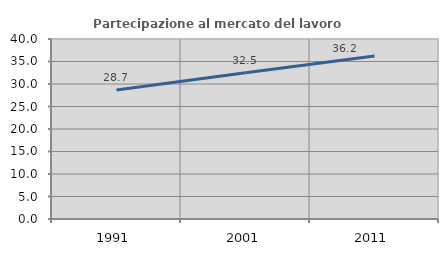
| Category | Partecipazione al mercato del lavoro  femminile |
|---|---|
| 1991.0 | 28.667 |
| 2001.0 | 32.48 |
| 2011.0 | 36.241 |